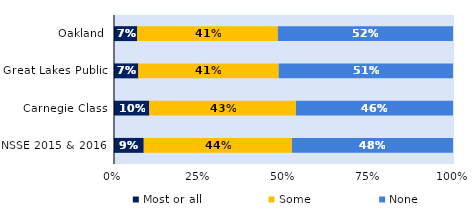
| Category | Most or all | Some | None |
|---|---|---|---|
| Oakland | 0.069 | 0.415 | 0.517 |
| Great Lakes Public | 0.072 | 0.414 | 0.514 |
| Carnegie Class | 0.104 | 0.433 | 0.463 |
| NSSE 2015 & 2016 | 0.088 | 0.437 | 0.475 |